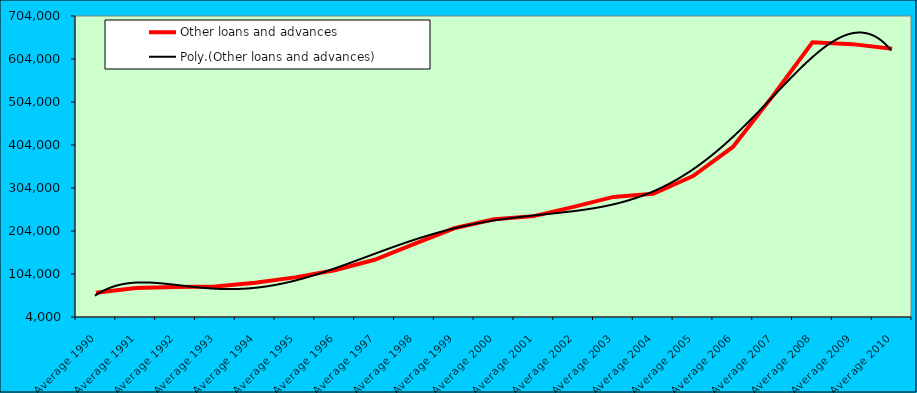
| Category | Other loans and advances |
|---|---|
| Average 1990 | 60359.25 |
| Average 1991 | 71693.667 |
| Average 1992 | 73763.083 |
| Average 1993 | 75123.5 |
| Average 1994 | 83583.167 |
| Average 1995 | 96156.25 |
| Average 1996 | 112671.5 |
| Average 1997 | 137051.333 |
| Average 1998 | 174201.333 |
| Average 1999 | 210321.909 |
| Average 2000 | 231208.333 |
| Average 2001 | 238603.455 |
| Average 2002 | 260087.583 |
| Average 2003 | 283225.333 |
| Average 2004 | 290516.667 |
| Average 2005 | 331649.833 |
| Average 2006 | 399517.583 |
| Average 2007 | 517626.5 |
| Average 2008 | 642976.083 |
| Average 2009 | 638565.667 |
| Average 2010 | 627955.375 |